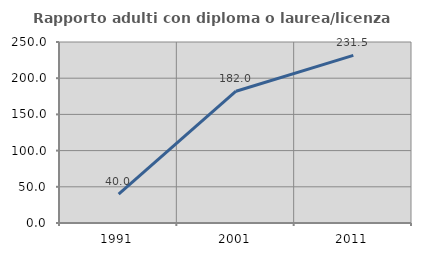
| Category | Rapporto adulti con diploma o laurea/licenza media  |
|---|---|
| 1991.0 | 40 |
| 2001.0 | 182 |
| 2011.0 | 231.481 |